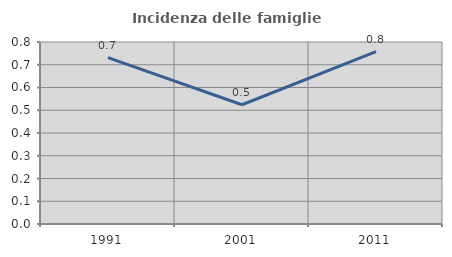
| Category | Incidenza delle famiglie numerose |
|---|---|
| 1991.0 | 0.731 |
| 2001.0 | 0.524 |
| 2011.0 | 0.758 |